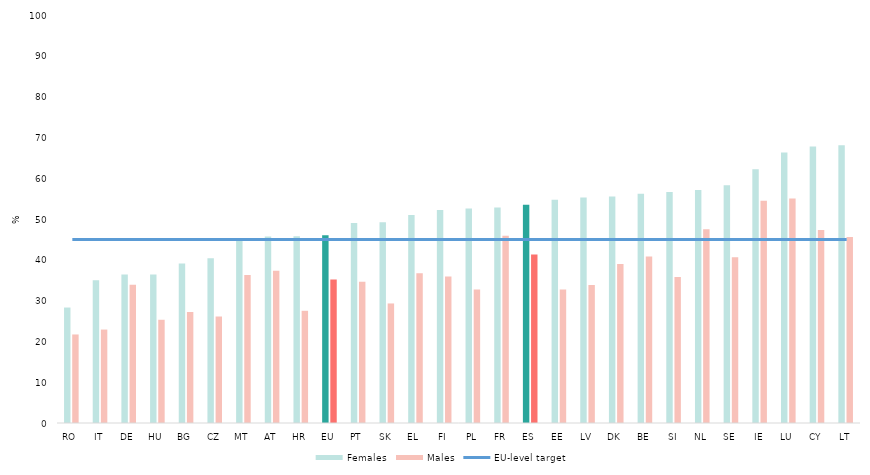
| Category | Females | Males |
|---|---|---|
| RO | 28.3 | 21.7 |
| IT | 35 | 22.9 |
| DE | 36.4 | 33.9 |
| HU | 36.4 | 25.3 |
| BG | 39.1 | 27.2 |
| CZ | 40.4 | 26.1 |
| MT | 44.7 | 36.3 |
| AT | 45.7 | 37.3 |
| HR | 45.8 | 27.5 |
| EU | 46 | 35.2 |
| PT | 49 | 34.6 |
| SK | 49.2 | 29.3 |
| EL | 51 | 36.7 |
| FI | 52.2 | 35.9 |
| PL | 52.6 | 32.7 |
| FR | 52.8 | 45.9 |
| ES | 53.5 | 41.3 |
| EE | 54.7 | 32.7 |
| LV | 55.3 | 33.8 |
| DK | 55.5 | 39 |
| BE | 56.2 | 40.8 |
| SI | 56.6 | 35.8 |
| NL | 57.1 | 47.5 |
| SE | 58.3 | 40.6 |
| IE | 62.2 | 54.5 |
| LU | 66.3 | 55 |
| CY | 67.8 | 47.3 |
| LT | 68.1 | 45.6 |